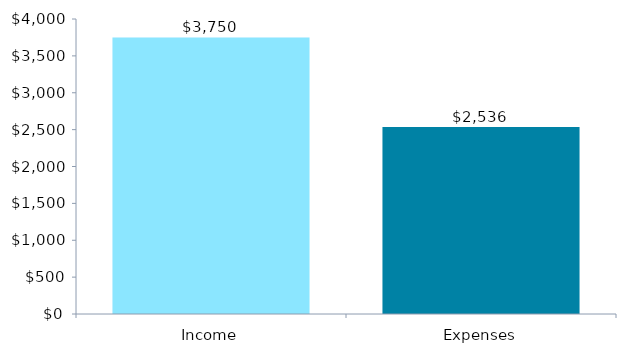
| Category | ChartData |
|---|---|
| 0 | 3750 |
| 1 | 2536 |